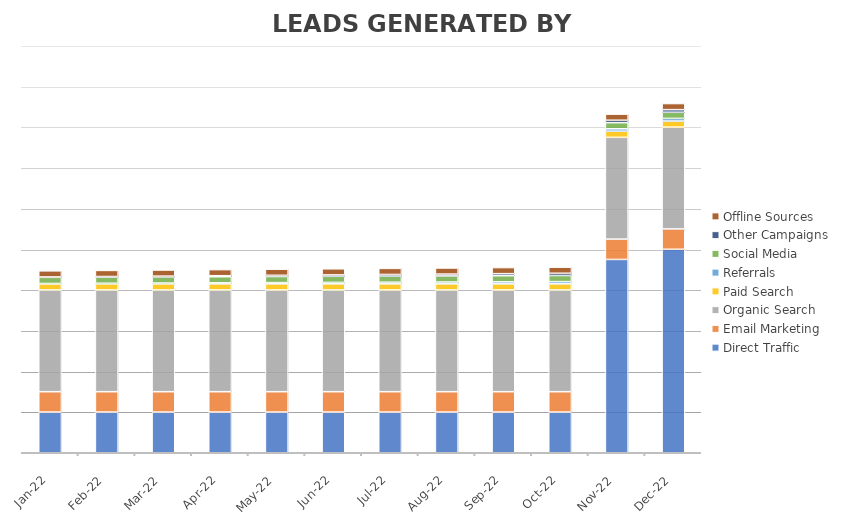
| Category | Direct Traffic | Email Marketing | Organic Search | Paid Search | Referrals | Social Media | Other Campaigns | Offline Sources |
|---|---|---|---|---|---|---|---|---|
| 2022-01-18 | 200 | 100 | 500 | 30 | 2 | 30 | 2 | 30 |
| 2022-02-18 | 200 | 100 | 500 | 30 | 3 | 30 | 3 | 30 |
| 2022-03-18 | 200 | 100 | 500 | 30 | 4 | 30 | 4 | 30 |
| 2022-04-18 | 200 | 100 | 500 | 30 | 5 | 30 | 5 | 30 |
| 2022-05-18 | 200 | 100 | 500 | 30 | 6 | 30 | 6 | 30 |
| 2022-06-18 | 200 | 100 | 500 | 30 | 7 | 30 | 7 | 30 |
| 2022-07-18 | 200 | 100 | 500 | 30 | 8 | 30 | 8 | 30 |
| 2022-08-18 | 200 | 100 | 500 | 30 | 9 | 30 | 9 | 30 |
| 2022-09-18 | 200 | 100 | 500 | 30 | 10 | 30 | 10 | 30 |
| 2022-10-18 | 200 | 100 | 500 | 30 | 11 | 30 | 11 | 30 |
| 2022-11-18 | 950 | 100 | 500 | 30 | 12 | 30 | 12 | 30 |
| 2022-12-18 | 1000 | 100 | 500 | 30 | 13 | 30 | 13 | 30 |